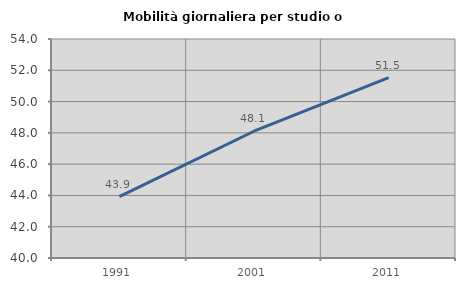
| Category | Mobilità giornaliera per studio o lavoro |
|---|---|
| 1991.0 | 43.921 |
| 2001.0 | 48.104 |
| 2011.0 | 51.532 |